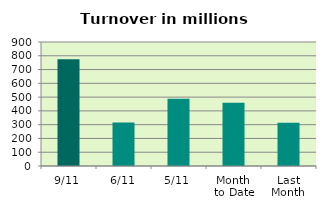
| Category | Series 0 |
|---|---|
| 9/11 | 774.144 |
| 6/11 | 316.168 |
| 5/11 | 488.897 |
| Month 
to Date | 459.223 |
| Last
Month | 314.143 |